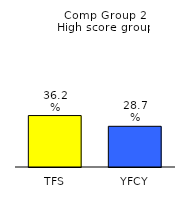
| Category | Series 0 |
|---|---|
| TFS | 0.362 |
| YFCY | 0.287 |